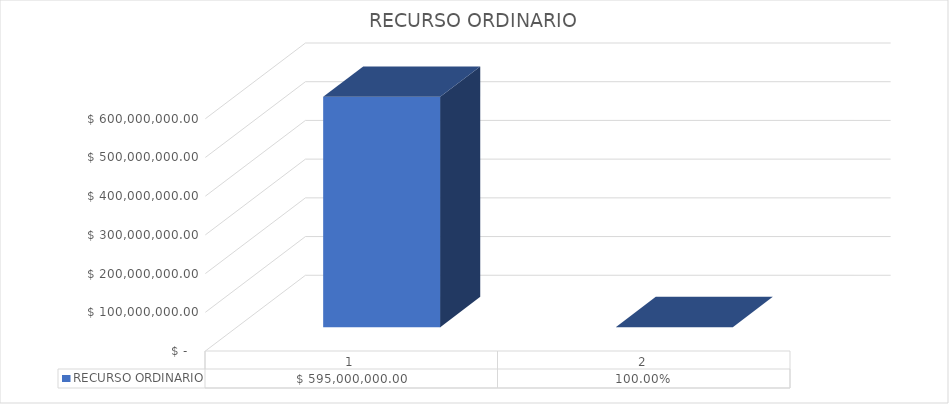
| Category |  RECURSO ORDINARIO  |
|---|---|
| 0 | 595000000 |
| 1 | 1 |